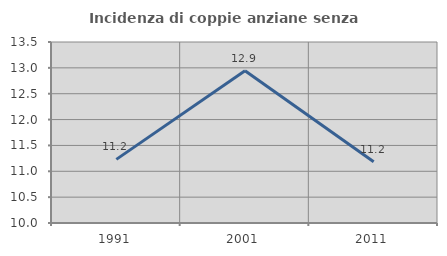
| Category | Incidenza di coppie anziane senza figli  |
|---|---|
| 1991.0 | 11.231 |
| 2001.0 | 12.942 |
| 2011.0 | 11.184 |